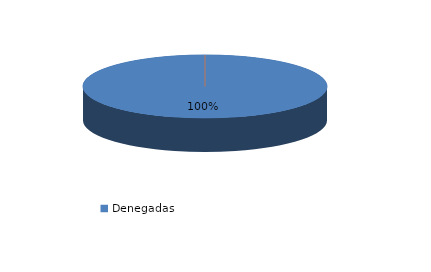
| Category | Series 0 |
|---|---|
| Denegadas | 4 |
| Adoptadas Solo Con Medidas Penales | 0 |
| Adoptadas Con Medidas Civiles Y Penales | 0 |
| Adoptadas Con Medidas Solo Civiles | 0 |